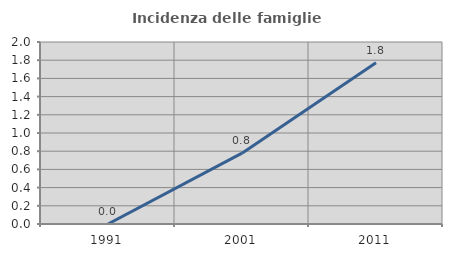
| Category | Incidenza delle famiglie numerose |
|---|---|
| 1991.0 | 0 |
| 2001.0 | 0.778 |
| 2011.0 | 1.773 |